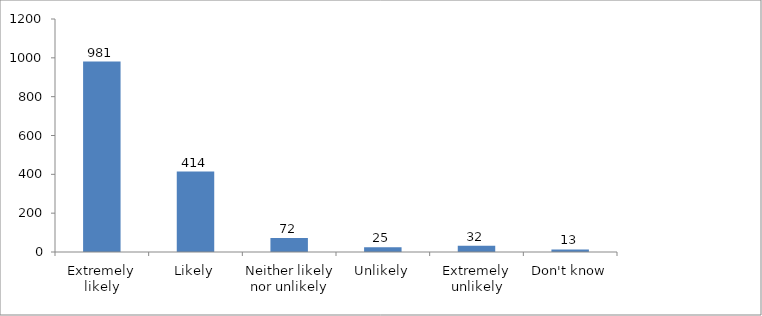
| Category | Series 0 |
|---|---|
| Extremely likely | 981 |
| Likely | 414 |
| Neither likely nor unlikely | 72 |
| Unlikely | 25 |
| Extremely unlikely | 32 |
| Don't know | 13 |